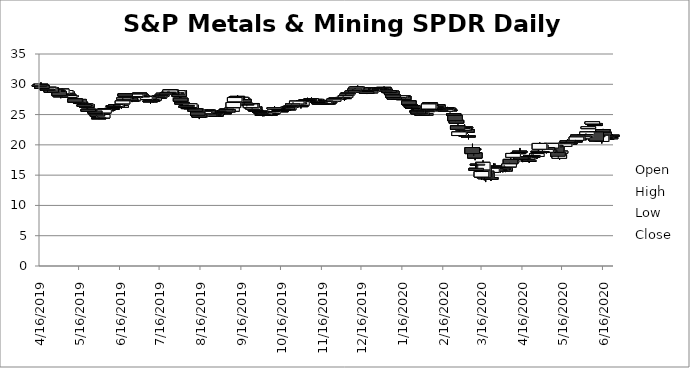
| Category | Open | High | Low | Close |
|---|---|---|---|---|
| 6/23/20 | 21.6 | 21.77 | 21.35 | 21.44 |
| 6/22/20 | 21.02 | 21.3 | 20.84 | 21.21 |
| 6/19/20 | 21.44 | 21.47 | 20.77 | 20.95 |
| 6/18/20 | 21.23 | 21.52 | 21 | 21.07 |
| 6/17/20 | 22.09 | 22.16 | 21.49 | 21.59 |
| 6/16/20 | 22.53 | 22.63 | 21.76 | 22.14 |
| 6/15/20 | 20.56 | 21.735 | 20.23 | 21.58 |
| 6/12/20 | 21.55 | 21.75 | 20.82 | 21.32 |
| 6/11/20 | 22.13 | 22.29 | 20.52 | 20.64 |
| 6/10/20 | 23.53 | 23.54 | 22.625 | 23.19 |
| 6/9/20 | 23.52 | 23.54 | 23.12 | 23.41 |
| 6/8/20 | 23.45 | 23.87 | 23.27 | 23.82 |
| 6/5/20 | 22.68 | 23.1 | 22.67 | 22.99 |
| 6/4/20 | 21.67 | 22.17 | 21.482 | 22.13 |
| 6/3/20 | 21.3 | 21.93 | 21.3 | 21.7 |
| 6/2/20 | 21.5 | 21.66 | 21.195 | 21.24 |
| 6/1/20 | 21.01 | 21.485 | 20.93 | 21.34 |
| 5/29/20 | 21.02 | 21.05 | 20.65 | 20.84 |
| 5/28/20 | 21.62 | 21.71 | 20.81 | 20.96 |
| 5/27/20 | 20.74 | 21.33 | 20.405 | 21.3 |
| 5/26/20 | 20.64 | 20.83 | 20.38 | 20.53 |
| 5/22/20 | 20.31 | 20.43 | 19.93 | 20.17 |
| 5/21/20 | 20.65 | 20.65 | 20.14 | 20.36 |
| 5/20/20 | 20.52 | 20.94 | 20.52 | 20.66 |
| 5/19/20 | 20.2 | 20.77 | 20.1 | 20.3 |
| 5/18/20 | 19.75 | 20.33 | 19.75 | 20.17 |
| 5/15/20 | 18.63 | 19.069 | 18.38 | 18.96 |
| 5/14/20 | 17.78 | 18.43 | 17.5 | 18.41 |
| 5/13/20 | 18.8 | 18.8 | 17.76 | 18.11 |
| 5/12/20 | 19.81 | 19.845 | 18.76 | 18.77 |
| 5/11/20 | 19.95 | 19.97 | 19.24 | 19.66 |
| 5/8/20 | 19.47 | 20.255 | 19.47 | 20.24 |
| 5/7/20 | 19.02 | 19.41 | 18.93 | 19.09 |
| 5/6/20 | 19.26 | 19.42 | 18.68 | 18.74 |
| 5/5/20 | 19.56 | 19.87 | 19.07 | 19.16 |
| 5/4/20 | 18.77 | 19.42 | 18.59 | 19.26 |
| 5/1/20 | 18.81 | 19.21 | 18.675 | 18.9 |
| 4/30/20 | 19.99 | 19.99 | 19.26 | 19.33 |
| 4/29/20 | 19.28 | 20.4 | 19.28 | 20.23 |
| 4/28/20 | 18.91 | 19.19 | 18.39 | 18.94 |
| 4/27/20 | 18.09 | 18.76 | 17.76 | 18.56 |
| 4/24/20 | 18.25 | 18.49 | 17.72 | 17.99 |
| 4/23/20 | 18.1 | 18.86 | 17.95 | 17.99 |
| 4/22/20 | 17.99 | 18.14 | 17.78 | 17.85 |
| 4/21/20 | 17.25 | 17.63 | 17.03 | 17.45 |
| 4/20/20 | 17.6 | 18.185 | 17.4 | 17.84 |
| 4/17/20 | 17.85 | 18.33 | 17.73 | 17.95 |
| 4/16/20 | 17.78 | 17.809 | 17.15 | 17.61 |
| 4/15/20 | 18 | 18 | 17.22 | 17.66 |
| 4/14/20 | 18.96 | 19.485 | 18.47 | 18.75 |
| 4/13/20 | 18.74 | 18.765 | 18.095 | 18.55 |
| 4/9/20 | 17.95 | 18.8 | 17.95 | 18.58 |
| 4/8/20 | 17.15 | 17.6 | 16.96 | 17.4 |
| 4/7/20 | 17.6 | 17.79 | 16.77 | 16.89 |
| 4/6/20 | 16.36 | 17.05 | 16.36 | 16.86 |
| 4/3/20 | 16.14 | 16.39 | 15.5 | 15.69 |
| 4/2/20 | 15.94 | 16.72 | 15.68 | 16.12 |
| 4/1/20 | 15.65 | 16.35 | 15.46 | 15.81 |
| 3/31/20 | 15.94 | 16.77 | 15.76 | 16.13 |
| 3/30/20 | 15.85 | 16.01 | 15.41 | 15.91 |
| 3/27/20 | 16.06 | 16.175 | 15.58 | 15.67 |
| 3/26/20 | 16.47 | 16.92 | 16.01 | 16.54 |
| 3/25/20 | 16.34 | 16.94 | 15.51 | 16.24 |
| 3/24/20 | 15.45 | 16.18 | 15.27 | 16.13 |
| 3/23/20 | 14.6 | 14.98 | 14.04 | 14.31 |
| 3/20/20 | 15.7 | 15.7 | 14.3 | 14.54 |
| 3/19/20 | 14.41 | 15.98 | 13.86 | 15.22 |
| 3/18/20 | 16.15 | 16.4 | 14.145 | 14.57 |
| 3/17/20 | 15.87 | 17.44 | 15.65 | 17.11 |
| 3/16/20 | 14.69 | 16.14 | 14.235 | 15.6 |
| 3/13/20 | 16.76 | 16.87 | 15.77 | 16.81 |
| 3/12/20 | 16.13 | 16.985 | 15.5 | 15.78 |
| 3/11/20 | 18.67 | 18.84 | 17.47 | 17.82 |
| 3/10/20 | 19.34 | 19.54 | 18.16 | 19.29 |
| 3/9/20 | 19.56 | 20.18 | 18.53 | 18.56 |
| 3/6/20 | 21.47 | 21.77 | 20.92 | 21.32 |
| 3/5/20 | 22.54 | 22.67 | 21.84 | 22.08 |
| 3/4/20 | 22.83 | 22.97 | 22.28 | 22.94 |
| 3/3/20 | 22.88 | 23.37 | 21.92 | 22.4 |
| 3/2/20 | 22.43 | 22.73 | 21.87 | 22.71 |
| 2/28/20 | 21.54 | 22.5 | 21.35 | 22.13 |
| 2/27/20 | 23.14 | 23.38 | 22.49 | 22.56 |
| 2/26/20 | 24.05 | 24.19 | 23.56 | 23.58 |
| 2/25/20 | 24.88 | 24.96 | 23.895 | 23.98 |
| 2/24/20 | 25.12 | 25.14 | 24.75 | 24.88 |
| 2/21/20 | 25.78 | 25.78 | 25.365 | 25.65 |
| 2/20/20 | 26.04 | 26.24 | 25.722 | 25.79 |
| 2/19/20 | 25.99 | 26.265 | 25.99 | 26.16 |
| 2/18/20 | 25.55 | 25.92 | 25.55 | 25.86 |
| 2/14/20 | 26.07 | 26.12 | 25.54 | 25.63 |
| 2/13/20 | 25.99 | 26.17 | 25.91 | 26.03 |
| 2/12/20 | 26.6 | 26.76 | 26.035 | 26.06 |
| 2/11/20 | 26.21 | 26.73 | 26.155 | 26.32 |
| 2/10/20 | 25.99 | 26.16 | 25.75 | 26.02 |
| 2/7/20 | 26.5 | 26.5 | 26 | 26.06 |
| 2/6/20 | 26.95 | 27 | 26.52 | 26.69 |
| 2/5/20 | 25.92 | 26.89 | 25.92 | 26.75 |
| 2/4/20 | 25.49 | 25.81 | 25.37 | 25.69 |
| 2/3/20 | 24.94 | 25.25 | 24.855 | 25.1 |
| 1/31/20 | 25.25 | 25.27 | 24.83 | 24.89 |
| 1/30/20 | 25.17 | 25.39 | 25.025 | 25.39 |
| 1/29/20 | 25.2 | 25.43 | 25.02 | 25.31 |
| 1/28/20 | 25.74 | 25.78 | 25.075 | 25.12 |
| 1/27/20 | 25.59 | 25.645 | 25.36 | 25.49 |
| 1/24/20 | 26.45 | 26.45 | 25.665 | 26 |
| 1/23/20 | 26.3 | 26.4 | 25.87 | 26.38 |
| 1/22/20 | 26.62 | 26.754 | 26.4 | 26.57 |
| 1/21/20 | 27.26 | 27.26 | 26.46 | 26.68 |
| 1/17/20 | 28.04 | 28.119 | 27.39 | 27.46 |
| 1/16/20 | 28.06 | 28.17 | 27.88 | 27.92 |
| 1/15/20 | 28.14 | 28.165 | 27.87 | 28.02 |
| 1/14/20 | 27.79 | 28.32 | 27.66 | 28.1 |
| 1/13/20 | 27.6 | 28.03 | 27.42 | 27.8 |
| 1/10/20 | 27.85 | 27.95 | 27.5 | 27.56 |
| 1/9/20 | 28.24 | 28.24 | 27.709 | 27.82 |
| 1/8/20 | 28.87 | 28.88 | 28.25 | 28.29 |
| 1/7/20 | 28.63 | 28.98 | 28.54 | 28.77 |
| 1/6/20 | 28.95 | 29 | 28.53 | 28.63 |
| 1/3/20 | 29.19 | 29.19 | 28.84 | 28.9 |
| 1/2/20 | 29.49 | 29.63 | 29.03 | 29.16 |
| 12/31/19 | 29.29 | 29.435 | 29.15 | 29.29 |
| 12/30/19 | 29.3 | 29.5 | 29.15 | 29.16 |
| 12/27/19 | 29.37 | 29.448 | 29.105 | 29.18 |
| 12/26/19 | 29.35 | 29.54 | 29.1 | 29.29 |
| 12/24/19 | 28.99 | 29.33 | 28.92 | 29.15 |
| 12/23/19 | 28.6 | 28.895 | 28.52 | 28.86 |
| 12/20/19 | 28.8 | 28.88 | 28.39 | 28.5 |
| 12/19/19 | 29.32 | 29.44 | 28.94 | 28.96 |
| 12/18/19 | 29.09 | 29.33 | 28.955 | 29.29 |
| 12/17/19 | 29.14 | 29.185 | 28.85 | 29.09 |
| 12/16/19 | 29.44 | 29.51 | 28.99 | 28.99 |
| 12/13/19 | 29.52 | 29.795 | 29.075 | 29.21 |
| 12/12/19 | 29.23 | 29.61 | 29.08 | 29.52 |
| 12/11/19 | 29.08 | 29.39 | 29.06 | 29.22 |
| 12/10/19 | 28.81 | 29.16 | 28.81 | 28.95 |
| 12/9/19 | 28.71 | 29.175 | 28.71 | 28.87 |
| 12/6/19 | 28.5 | 28.87 | 28.5 | 28.6 |
| 12/5/19 | 28.18 | 28.42 | 28.08 | 28.37 |
| 12/4/19 | 27.86 | 28.423 | 27.86 | 28.13 |
| 12/3/19 | 27.64 | 27.82 | 27.28 | 27.81 |
| 12/2/19 | 27.75 | 28.08 | 27.72 | 27.83 |
| 11/29/19 | 27.72 | 27.81 | 27.4 | 27.66 |
| 11/27/19 | 27.65 | 27.78 | 27.35 | 27.77 |
| 11/26/19 | 27.52 | 27.77 | 27.46 | 27.66 |
| 11/25/19 | 27.22 | 27.78 | 27.055 | 27.53 |
| 11/22/19 | 26.97 | 27.278 | 26.925 | 27.12 |
| 11/21/19 | 26.94 | 27.07 | 26.64 | 26.77 |
| 11/20/19 | 26.91 | 27.28 | 26.78 | 26.95 |
| 11/19/19 | 27.25 | 27.39 | 26.975 | 27.06 |
| 11/18/19 | 26.85 | 27.17 | 26.66 | 27.17 |
| 11/15/19 | 26.95 | 27.18 | 26.805 | 26.93 |
| 11/14/19 | 26.92 | 27.11 | 26.77 | 26.8 |
| 11/13/19 | 27.19 | 27.26 | 26.94 | 26.99 |
| 11/12/19 | 27.5 | 27.62 | 27.225 | 27.35 |
| 11/11/19 | 27.39 | 27.59 | 27.17 | 27.5 |
| 11/8/19 | 27.19 | 27.81 | 27.1 | 27.64 |
| 11/7/19 | 27.4 | 27.61 | 27.26 | 27.47 |
| 11/6/19 | 27.38 | 27.44 | 27.14 | 27.24 |
| 11/5/19 | 27.47 | 27.77 | 27.335 | 27.47 |
| 11/4/19 | 27.41 | 27.55 | 27.18 | 27.42 |
| 11/1/19 | 26.55 | 27.285 | 26.55 | 27.13 |
| 10/31/19 | 26.51 | 26.63 | 26.02 | 26.31 |
| 10/30/19 | 26.97 | 26.97 | 26.47 | 26.74 |
| 10/29/19 | 27 | 27.28 | 26.78 | 27.15 |
| 10/28/19 | 26.76 | 27.36 | 26.76 | 27.22 |
| 10/25/19 | 26.59 | 27.085 | 26.53 | 26.77 |
| 10/24/19 | 26.36 | 26.68 | 26.105 | 26.45 |
| 10/23/19 | 26.3 | 26.53 | 26.03 | 26.36 |
| 10/22/19 | 25.79 | 26.31 | 25.69 | 26.24 |
| 10/21/19 | 26.19 | 26.47 | 25.8 | 25.82 |
| 10/18/19 | 25.87 | 26.13 | 25.7 | 25.88 |
| 10/17/19 | 25.84 | 26.09 | 25.64 | 25.87 |
| 10/16/19 | 25.63 | 26.02 | 25.47 | 25.61 |
| 10/15/19 | 25.77 | 26.18 | 25.56 | 25.78 |
| 10/14/19 | 25.99 | 26.06 | 25.5 | 25.84 |
| 10/11/19 | 25.94 | 26.36 | 25.79 | 26.14 |
| 10/10/19 | 25.19 | 25.585 | 25.12 | 25.5 |
| 10/9/19 | 25.25 | 25.29 | 24.76 | 25.02 |
| 10/8/19 | 25.09 | 25.24 | 24.87 | 25.09 |
| 10/7/19 | 25.22 | 25.6 | 25.15 | 25.23 |
| 10/4/19 | 25.08 | 25.38 | 24.92 | 25.37 |
| 10/3/19 | 24.95 | 25.205 | 24.72 | 25.06 |
| 10/2/19 | 25.04 | 25.1 | 24.72 | 24.93 |
| 10/1/19 | 25.56 | 26.12 | 25.15 | 25.21 |
| 9/30/19 | 25.53 | 25.61 | 25.27 | 25.45 |
| 9/27/19 | 25.74 | 25.96 | 25.56 | 25.7 |
| 9/26/19 | 26.28 | 26.28 | 25.53 | 25.78 |
| 9/25/19 | 25.86 | 26.42 | 25.83 | 26.32 |
| 9/24/19 | 26.83 | 26.83 | 25.94 | 26.08 |
| 9/23/19 | 26.15 | 26.995 | 26.09 | 26.75 |
| 9/20/19 | 26.77 | 26.84 | 26.34 | 26.55 |
| 9/19/19 | 26.75 | 27.2 | 26.7 | 26.88 |
| 9/18/19 | 27.51 | 27.6 | 26.63 | 27.06 |
| 9/17/19 | 27.6 | 27.795 | 27.27 | 27.69 |
| 9/16/19 | 27.49 | 28.04 | 27.44 | 27.84 |
| 9/13/19 | 28 | 28.21 | 27.57 | 27.57 |
| 9/12/19 | 27.9 | 27.99 | 27.42 | 27.65 |
| 9/11/19 | 27.11 | 27.86 | 26.775 | 27.81 |
| 9/10/19 | 26.16 | 27.02 | 26.1 | 26.99 |
| 9/9/19 | 25.55 | 26.22 | 25.55 | 26.1 |
| 9/6/19 | 25.85 | 25.93 | 25.43 | 25.45 |
| 9/5/19 | 25.91 | 26.27 | 25.77 | 25.85 |
| 9/4/19 | 25.47 | 25.785 | 25.47 | 25.72 |
| 9/3/19 | 25.29 | 25.36 | 25 | 25.19 |
| 8/30/19 | 25.57 | 25.72 | 25.32 | 25.46 |
| 8/29/19 | 25.45 | 25.73 | 25.31 | 25.38 |
| 8/28/19 | 24.76 | 25.39 | 24.69 | 25.14 |
| 8/27/19 | 25.06 | 25.08 | 24.72 | 24.72 |
| 8/26/19 | 24.97 | 25 | 24.63 | 24.83 |
| 8/23/19 | 25.1 | 25.32 | 24.625 | 24.7 |
| 8/22/19 | 25.73 | 25.73 | 25.24 | 25.26 |
| 8/21/19 | 25.71 | 25.8 | 25.5 | 25.6 |
| 8/20/19 | 25.4 | 25.67 | 25.35 | 25.56 |
| 8/19/19 | 25.15 | 25.71 | 25.146 | 25.53 |
| 8/16/19 | 24.65 | 25.18 | 24.514 | 24.98 |
| 8/15/19 | 24.98 | 24.98 | 24.26 | 24.59 |
| 8/14/19 | 25.42 | 25.46 | 24.87 | 24.89 |
| 8/13/19 | 25.52 | 26.31 | 25.46 | 25.88 |
| 8/12/19 | 25.94 | 25.94 | 25.41 | 25.55 |
| 8/9/19 | 26.55 | 26.57 | 25.94 | 25.96 |
| 8/8/19 | 26.15 | 26.865 | 26.09 | 26.77 |
| 8/7/19 | 26.15 | 26.3 | 25.795 | 26.04 |
| 8/6/19 | 26.51 | 26.59 | 25.96 | 26.37 |
| 8/5/19 | 26.31 | 26.604 | 26.15 | 26.39 |
| 8/2/19 | 27.02 | 27.02 | 26.43 | 26.74 |
| 8/1/19 | 27.71 | 27.86 | 26.94 | 27.2 |
| 7/31/19 | 28.95 | 29 | 27.75 | 27.97 |
| 7/30/19 | 28.36 | 29 | 28.17 | 28.95 |
| 7/29/19 | 28.62 | 28.69 | 28.29 | 28.57 |
| 7/26/19 | 28.41 | 28.64 | 28.23 | 28.63 |
| 7/25/19 | 29.03 | 29.06 | 28.24 | 28.39 |
| 7/24/19 | 28.55 | 29.1 | 28.5 | 29.06 |
| 7/23/19 | 28.71 | 28.94 | 28.52 | 28.71 |
| 7/22/19 | 28.6 | 28.83 | 28.4 | 28.56 |
| 7/19/19 | 28.34 | 28.76 | 28.31 | 28.52 |
| 7/18/19 | 28.1 | 28.39 | 27.9 | 28.27 |
| 7/17/19 | 28.1 | 28.197 | 27.72 | 28.13 |
| 7/16/19 | 27.73 | 28.53 | 27.63 | 28.08 |
| 7/15/19 | 27.94 | 28 | 27.52 | 27.78 |
| 7/12/19 | 27.4 | 27.79 | 27.35 | 27.73 |
| 7/11/19 | 27.4 | 27.4 | 27.02 | 27.26 |
| 7/10/19 | 27.5 | 27.72 | 27.22 | 27.38 |
| 7/9/19 | 27.21 | 27.29 | 26.77 | 27.26 |
| 7/8/19 | 28 | 28.08 | 27.37 | 27.47 |
| 7/5/19 | 27.48 | 28.05 | 27.3 | 27.99 |
| 7/3/19 | 28.06 | 28.14 | 27.73 | 27.9 |
| 7/2/19 | 28.29 | 28.29 | 27.855 | 27.99 |
| 7/1/19 | 28.55 | 28.55 | 28.07 | 28.19 |
| 6/28/19 | 27.95 | 28.395 | 27.9 | 28.38 |
| 6/27/19 | 27.94 | 27.98 | 27.7 | 27.89 |
| 6/26/19 | 27.28 | 27.91 | 27.28 | 27.82 |
| 6/25/19 | 27.42 | 27.55 | 27.06 | 27.29 |
| 6/24/19 | 27.76 | 27.83 | 27.295 | 27.36 |
| 6/21/19 | 27.79 | 27.85 | 27.54 | 27.73 |
| 6/20/19 | 28.42 | 28.513 | 28.02 | 28.04 |
| 6/19/19 | 27.52 | 27.87 | 27.46 | 27.75 |
| 6/18/19 | 26.77 | 27.73 | 26.77 | 27.26 |
| 6/17/19 | 26.2 | 26.65 | 25.98 | 26.48 |
| 6/14/19 | 26.61 | 26.645 | 26.247 | 26.29 |
| 6/13/19 | 26.29 | 26.76 | 26.26 | 26.66 |
| 6/12/19 | 26.32 | 26.57 | 26.11 | 26.17 |
| 6/11/19 | 26.46 | 26.666 | 26.25 | 26.32 |
| 6/10/19 | 26.03 | 26.26 | 25.88 | 25.92 |
| 6/7/19 | 25.91 | 26.04 | 25.57 | 25.9 |
| 6/6/19 | 25.8 | 25.93 | 25.4 | 25.77 |
| 6/5/19 | 26 | 26.02 | 25.45 | 25.67 |
| 6/4/19 | 25.27 | 25.93 | 25.25 | 25.86 |
| 6/3/19 | 24.44 | 25.15 | 24.44 | 25.02 |
| 5/31/19 | 24.46 | 24.61 | 24.25 | 24.4 |
| 5/30/19 | 25.11 | 25.26 | 24.61 | 24.73 |
| 5/29/19 | 24.99 | 25.18 | 24.8 | 25.16 |
| 5/28/19 | 25.6 | 25.75 | 25.16 | 25.25 |
| 5/24/19 | 25.86 | 25.92 | 25.39 | 25.55 |
| 5/23/19 | 25.88 | 25.93 | 25.36 | 25.54 |
| 5/22/19 | 26.67 | 26.76 | 26 | 26.19 |
| 5/21/19 | 26.5 | 26.93 | 26.35 | 26.77 |
| 5/20/19 | 26.65 | 26.76 | 26.32 | 26.36 |
| 5/17/19 | 27.07 | 27.12 | 26.71 | 26.91 |
| 5/16/19 | 27.5 | 27.62 | 27.25 | 27.34 |
| 5/15/19 | 27.04 | 27.43 | 26.93 | 27.43 |
| 5/14/19 | 27.18 | 27.45 | 27.05 | 27.32 |
| 5/13/19 | 27.6 | 27.61 | 26.74 | 27.05 |
| 5/10/19 | 28.04 | 28.26 | 27.64 | 28.12 |
| 5/9/19 | 27.84 | 28.21 | 27.67 | 28.15 |
| 5/8/19 | 28.37 | 28.63 | 28.12 | 28.16 |
| 5/7/19 | 28.74 | 28.84 | 28.3 | 28.52 |
| 5/6/19 | 28.54 | 29.05 | 28.49 | 28.97 |
| 5/3/19 | 28.44 | 29.28 | 28.4 | 29.21 |
| 5/2/19 | 28 | 28.3 | 27.7 | 28.1 |
| 5/1/19 | 28.85 | 28.96 | 28.08 | 28.12 |
| 4/30/19 | 29.06 | 29.06 | 28.7 | 28.83 |
| 4/29/19 | 29.09 | 29.1 | 28.798 | 29.09 |
| 4/26/19 | 28.71 | 29.12 | 28.7 | 29.05 |
| 4/25/19 | 29.41 | 29.44 | 28.64 | 28.69 |
| 4/24/19 | 29.48 | 29.505 | 29.28 | 29.35 |
| 4/23/19 | 29.04 | 29.65 | 29.03 | 29.5 |
| 4/22/19 | 29.22 | 29.31 | 28.732 | 29.03 |
| 4/18/19 | 29.8 | 29.8 | 29.22 | 29.31 |
| 4/17/19 | 30.01 | 30.32 | 29.785 | 29.86 |
| 4/16/19 | 29.74 | 29.94 | 29.627 | 29.85 |